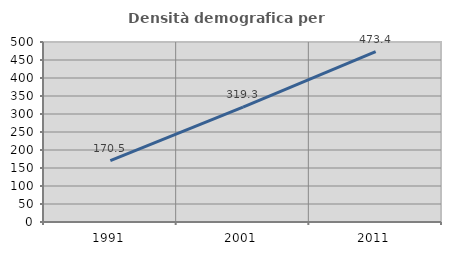
| Category | Densità demografica |
|---|---|
| 1991.0 | 170.531 |
| 2001.0 | 319.334 |
| 2011.0 | 473.427 |